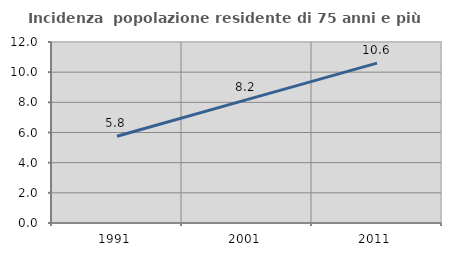
| Category | Incidenza  popolazione residente di 75 anni e più |
|---|---|
| 1991.0 | 5.753 |
| 2001.0 | 8.181 |
| 2011.0 | 10.603 |